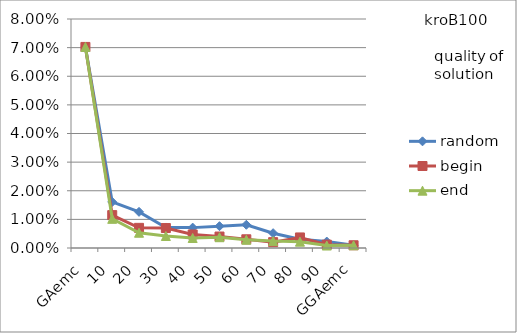
| Category | random | begin | end |
|---|---|---|---|
| 0 | 0.07 | 0.07 | 0.07 |
| 1 | 0.016 | 0.011 | 0.01 |
| 2 | 0.013 | 0.007 | 0.005 |
| 3 | 0.007 | 0.007 | 0.004 |
| 4 | 0.007 | 0.005 | 0.003 |
| 5 | 0.008 | 0.004 | 0.004 |
| 6 | 0.008 | 0.003 | 0.003 |
| 7 | 0.005 | 0.002 | 0.002 |
| 8 | 0.003 | 0.004 | 0.002 |
| 9 | 0.002 | 0.001 | 0.001 |
| 10 | 0.001 | 0.001 | 0.001 |